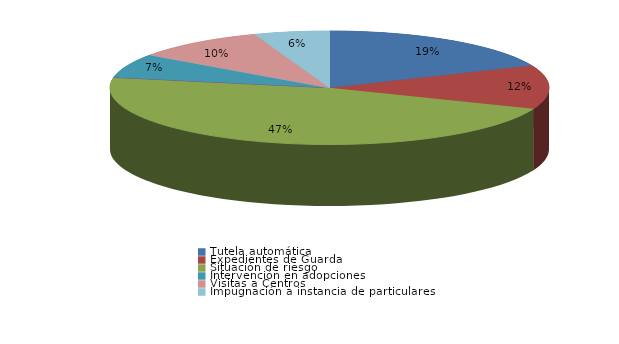
| Category | Series 0 |
|---|---|
| Tutela automática | 27 |
| Expedientes de Guarda | 18 |
| Situación de riesgo | 68 |
| Intervención en acogimientos | 0 |
| Intervención en adopciones | 10 |
| Defensa de los derechos fundamentales | 0 |
| Sustracción internacional de menores | 0 |
| Visitas a Centros | 14 |
| Ensayos Clínicos | 0 |
| Impugnación a instacia del Fiscal | 0 |
| Impugnación a instancia de particulares | 8 |